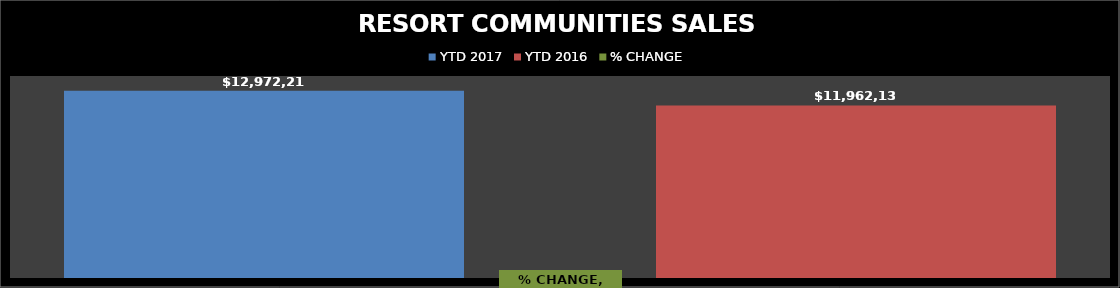
| Category | YTD 2017 | YTD 2016 |
|---|---|---|
| RESORT COMMUNITIES SALES TAX - 2017 | 12972218.2 | 11962139.26 |